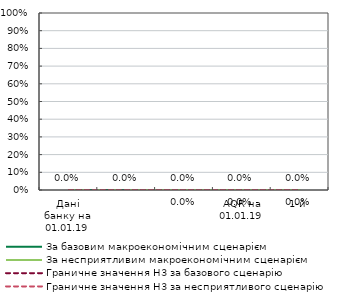
| Category | За базовим макроекономічним сценарієм | За несприятливим макроекономічним сценарієм | Граничне значення Н3 за базового сценарію | Граничне значення Н3 за несприятливого сценарію |
|---|---|---|---|---|
| Дані банку на 01.01.19 | 0 | 0 | 0 | 0 |
| AQR на 01.01.19 | 0 | 0 | 0 | 0 |
| 1-й | 0 | 0 | 0 | 0 |
| 2-й | 0 | 0 | 0 | 0 |
| 3-й | 0 | 0 | 0 | 0 |